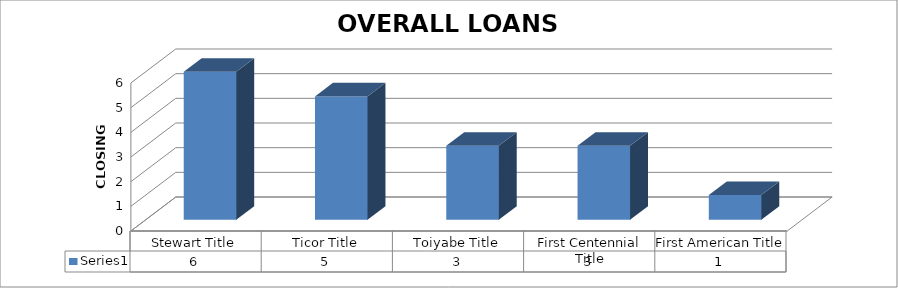
| Category | Series 0 |
|---|---|
| Stewart Title | 6 |
| Ticor Title | 5 |
| Toiyabe Title | 3 |
| First Centennial Title | 3 |
| First American Title | 1 |